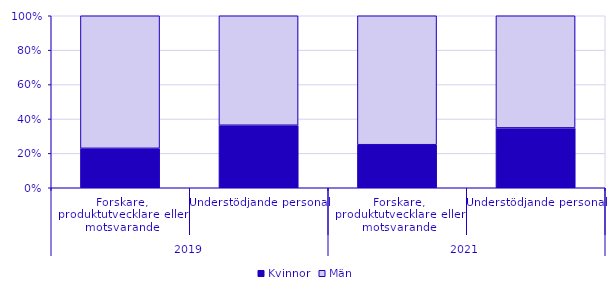
| Category | Kvinnor | Män |
|---|---|---|
| 0 | 16788 | 56468 |
| 1 | 4075 | 7142 |
| 2 | 19414 | 58185 |
| 3 | 3952 | 7403 |